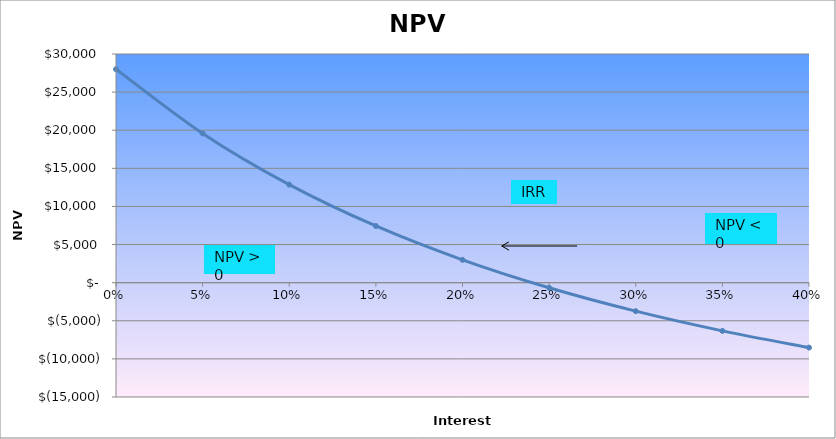
| Category | Series 0 |
|---|---|
| 0.0 | 28000 |
| 0.05 | 19579.812 |
| 0.1 | 12863.938 |
| 0.15 | 7436.563 |
| 0.2 | 2997.685 |
| 0.25 | -672.64 |
| 0.3 | -3738.045 |
| 0.35 | -6321.921 |
| 0.4 | -8518.474 |